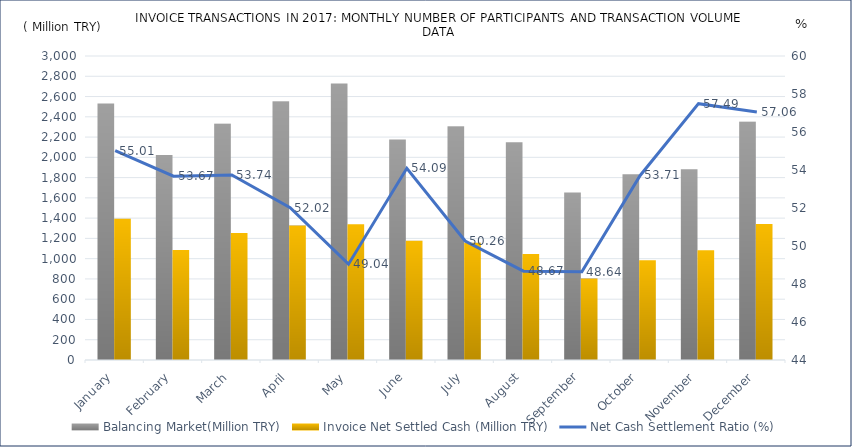
| Category | Balancing Market(Million TRY) | Invoice Net Settled Cash (Million TRY) |
|---|---|---|
| January | 2531.668 | 1392.775 |
| February | 2024.114 | 1086.365 |
| March | 2331.957 | 1253.093 |
| April | 2550.508 | 1326.657 |
| May | 2729.379 | 1338.547 |
| June | 2176 | 1177 |
| July | 2304 | 1158 |
| August | 2149 | 1046 |
| September | 1653 | 804 |
| October | 1832 | 984 |
| November | 1882 | 1082 |
| December | 2352 | 1342 |